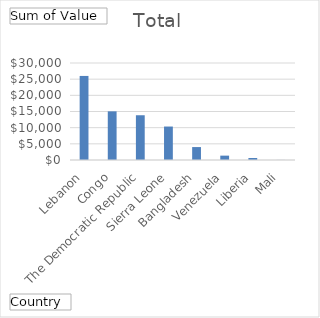
| Category | Total |
|---|---|
| Lebanon | 26000 |
| Congo, The Democratic Republic | 15045 |
| Sierra Leone | 13840 |
| Bangladesh | 10348.83 |
| Venezuela | 4001.15 |
| Liberia | 1350 |
| Mali | 625 |
| Cuba | 21 |